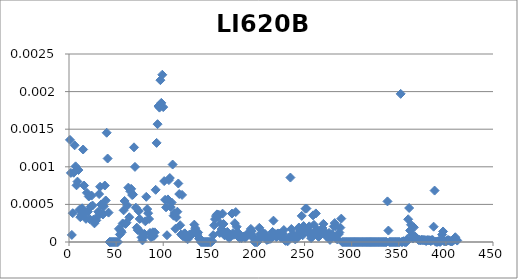
| Category |  LI620B |
|---|---|
| 0 | 0.001 |
| 1 | 0.001 |
| 2 | 0 |
| 3 | 0 |
| 4 | 0.001 |
| 5 | 0.001 |
| 6 | 0.001 |
| 7 | 0.001 |
| 8 | 0.001 |
| 9 | 0.001 |
| 10 | 0 |
| 11 | 0 |
| 12 | 0 |
| 13 | 0 |
| 14 | 0.001 |
| 15 | 0.001 |
| 16 | 0 |
| 17 | 0 |
| 18 | 0.001 |
| 19 | 0 |
| 20 | 0.001 |
| 21 | 0 |
| 22 | 0 |
| 23 | 0.001 |
| 24 | 0 |
| 25 | 0 |
| 26 | 0 |
| 27 | 0 |
| 28 | 0 |
| 29 | 0 |
| 30 | 0 |
| 31 | 0.001 |
| 32 | 0.001 |
| 33 | 0 |
| 34 | 0 |
| 35 | 0 |
| 36 | 0 |
| 37 | 0.001 |
| 38 | 0.001 |
| 39 | 0.001 |
| 40 | 0.001 |
| 41 | 0 |
| 42 | 0 |
| 43 | 0 |
| 44 | 0 |
| 45 | 0 |
| 46 | 0 |
| 47 | 0 |
| 48 | 0 |
| 49 | 0 |
| 50 | 0 |
| 51 | 0 |
| 52 | 0 |
| 53 | 0 |
| 54 | 0 |
| 55 | 0 |
| 56 | 0 |
| 57 | 0 |
| 58 | 0.001 |
| 59 | 0 |
| 60 | 0 |
| 61 | 0 |
| 62 | 0.001 |
| 63 | 0 |
| 64 | 0.001 |
| 65 | 0.001 |
| 66 | 0.001 |
| 67 | 0.001 |
| 68 | 0.001 |
| 69 | 0.001 |
| 70 | 0 |
| 71 | 0 |
| 72 | 0 |
| 73 | 0 |
| 74 | 0 |
| 75 | 0 |
| 76 | 0 |
| 77 | 0 |
| 78 | 0 |
| 79 | 0 |
| 80 | 0 |
| 81 | 0.001 |
| 82 | 0 |
| 83 | 0 |
| 84 | 0 |
| 85 | 0 |
| 86 | 0 |
| 87 | 0 |
| 88 | 0 |
| 89 | 0 |
| 90 | 0 |
| 91 | 0.001 |
| 92 | 0.001 |
| 93 | 0.002 |
| 94 | 0.002 |
| 95 | 0.002 |
| 96 | 0.002 |
| 97 | 0.002 |
| 98 | 0.002 |
| 99 | 0.002 |
| 100 | 0.001 |
| 101 | 0.001 |
| 102 | 0 |
| 103 | 0 |
| 104 | 0.001 |
| 105 | 0.001 |
| 106 | 0.001 |
| 107 | 0 |
| 108 | 0.001 |
| 109 | 0.001 |
| 110 | 0 |
| 111 | 0 |
| 112 | 0 |
| 113 | 0 |
| 114 | 0 |
| 115 | 0.001 |
| 116 | 0.001 |
| 117 | 0 |
| 118 | 0 |
| 119 | 0.001 |
| 120 | 0 |
| 121 | 0 |
| 122 | 0 |
| 123 | 0 |
| 124 | 0 |
| 125 | 0 |
| 126 | 0 |
| 127 | 0 |
| 128 | 0 |
| 129 | 0 |
| 130 | 0 |
| 131 | 0 |
| 132 | 0 |
| 133 | 0 |
| 134 | 0 |
| 135 | 0 |
| 136 | 0 |
| 137 | 0 |
| 138 | 0 |
| 139 | 0 |
| 140 | 0 |
| 141 | 0 |
| 142 | 0 |
| 143 | 0 |
| 144 | 0 |
| 145 | 0 |
| 146 | 0 |
| 147 | 0 |
| 148 | 0 |
| 149 | 0 |
| 150 | 0 |
| 151 | 0 |
| 152 | 0 |
| 153 | 0 |
| 154 | 0 |
| 155 | 0 |
| 156 | 0 |
| 157 | 0 |
| 158 | 0 |
| 159 | 0 |
| 160 | 0 |
| 161 | 0 |
| 162 | 0 |
| 163 | 0 |
| 164 | 0 |
| 165 | 0 |
| 166 | 0 |
| 167 | 0 |
| 168 | 0 |
| 169 | 0 |
| 170 | 0 |
| 171 | 0 |
| 172 | 0 |
| 173 | 0 |
| 174 | 0 |
| 175 | 0 |
| 176 | 0 |
| 177 | 0 |
| 178 | 0 |
| 179 | 0 |
| 180 | 0 |
| 181 | 0 |
| 182 | 0 |
| 183 | 0 |
| 184 | 0 |
| 185 | 0 |
| 186 | 0 |
| 187 | 0 |
| 188 | 0 |
| 189 | 0 |
| 190 | 0 |
| 191 | 0 |
| 192 | 0 |
| 193 | 0 |
| 194 | 0 |
| 195 | 0 |
| 196 | 0 |
| 197 | 0 |
| 198 | 0 |
| 199 | 0 |
| 200 | 0 |
| 201 | 0 |
| 202 | 0 |
| 203 | 0 |
| 204 | 0 |
| 205 | 0 |
| 206 | 0 |
| 207 | 0 |
| 208 | 0 |
| 209 | 0 |
| 210 | 0 |
| 211 | 0 |
| 212 | 0 |
| 213 | 0 |
| 214 | 0 |
| 215 | 0 |
| 216 | 0 |
| 217 | 0 |
| 218 | 0 |
| 219 | 0 |
| 220 | 0 |
| 221 | 0 |
| 222 | 0 |
| 223 | 0 |
| 224 | 0 |
| 225 | 0 |
| 226 | 0 |
| 227 | 0 |
| 228 | 0 |
| 229 | 0 |
| 230 | 0 |
| 231 | 0 |
| 232 | 0 |
| 233 | 0 |
| 234 | 0.001 |
| 235 | 0 |
| 236 | 0 |
| 237 | 0 |
| 238 | 0 |
| 239 | 0 |
| 240 | 0 |
| 241 | 0 |
| 242 | 0 |
| 243 | 0 |
| 244 | 0 |
| 245 | 0 |
| 246 | 0 |
| 247 | 0 |
| 248 | 0 |
| 249 | 0 |
| 250 | 0 |
| 251 | 0 |
| 252 | 0 |
| 253 | 0 |
| 254 | 0 |
| 255 | 0 |
| 256 | 0 |
| 257 | 0 |
| 258 | 0 |
| 259 | 0 |
| 260 | 0 |
| 261 | 0 |
| 262 | 0 |
| 263 | 0 |
| 264 | 0 |
| 265 | 0 |
| 266 | 0 |
| 267 | 0 |
| 268 | 0 |
| 269 | 0 |
| 270 | 0 |
| 271 | 0 |
| 272 | 0 |
| 273 | 0 |
| 274 | 0 |
| 275 | 0 |
| 276 | 0 |
| 277 | 0 |
| 278 | 0 |
| 279 | 0 |
| 280 | 0 |
| 281 | 0 |
| 282 | 0 |
| 283 | 0 |
| 284 | 0 |
| 285 | 0 |
| 286 | 0 |
| 287 | 0 |
| 288 | 0 |
| 289 | 0 |
| 290 | 0 |
| 291 | 0 |
| 292 | 0 |
| 293 | 0 |
| 294 | 0 |
| 295 | 0 |
| 296 | 0 |
| 297 | 0 |
| 298 | 0 |
| 299 | 0 |
| 300 | 0 |
| 301 | 0 |
| 302 | 0 |
| 303 | 0 |
| 304 | 0 |
| 305 | 0 |
| 306 | 0 |
| 307 | 0 |
| 308 | 0 |
| 309 | 0 |
| 310 | 0 |
| 311 | 0 |
| 312 | 0 |
| 313 | 0 |
| 314 | 0 |
| 315 | 0 |
| 316 | 0 |
| 317 | 0 |
| 318 | 0 |
| 319 | 0 |
| 320 | 0 |
| 321 | 0 |
| 322 | 0 |
| 323 | 0 |
| 324 | 0 |
| 325 | 0 |
| 326 | 0 |
| 327 | 0 |
| 328 | 0 |
| 329 | 0 |
| 330 | 0 |
| 331 | 0 |
| 332 | 0 |
| 333 | 0 |
| 334 | 0 |
| 335 | 0 |
| 336 | 0 |
| 337 | 0.001 |
| 338 | 0 |
| 339 | 0 |
| 340 | 0 |
| 341 | 0 |
| 342 | 0 |
| 343 | 0 |
| 344 | 0 |
| 345 | 0 |
| 346 | 0 |
| 347 | 0 |
| 348 | 0 |
| 349 | 0 |
| 350 | 0 |
| 351 | 0.002 |
| 352 | 0 |
| 353 | 0 |
| 354 | 0 |
| 355 | 0 |
| 356 | 0 |
| 357 | 0 |
| 358 | 0 |
| 359 | 0 |
| 360 | 0 |
| 361 | 0 |
| 362 | 0 |
| 363 | 0 |
| 364 | 0 |
| 365 | 0 |
| 366 | 0 |
| 367 | 0 |
| 368 | 0 |
| 369 | 0 |
| 370 | 0 |
| 371 | 0 |
| 372 | 0 |
| 373 | 0 |
| 374 | 0 |
| 375 | 0 |
| 376 | 0 |
| 377 | 0 |
| 378 | 0 |
| 379 | 0 |
| 380 | 0 |
| 381 | 0 |
| 382 | 0 |
| 383 | 0 |
| 384 | 0 |
| 385 | 0 |
| 386 | 0 |
| 387 | 0.001 |
| 388 | 0 |
| 389 | 0 |
| 390 | 0 |
| 391 | 0 |
| 392 | 0 |
| 393 | 0 |
| 394 | 0 |
| 395 | 0 |
| 396 | 0 |
| 397 | 0 |
| 398 | 0 |
| 399 | 0 |
| 400 | 0 |
| 401 | 0 |
| 402 | 0 |
| 403 | 0 |
| 404 | 0 |
| 405 | 0 |
| 406 | 0 |
| 407 | 0 |
| 408 | 0 |
| 409 | 0 |
| 410 | 0 |
| 411 | 0 |